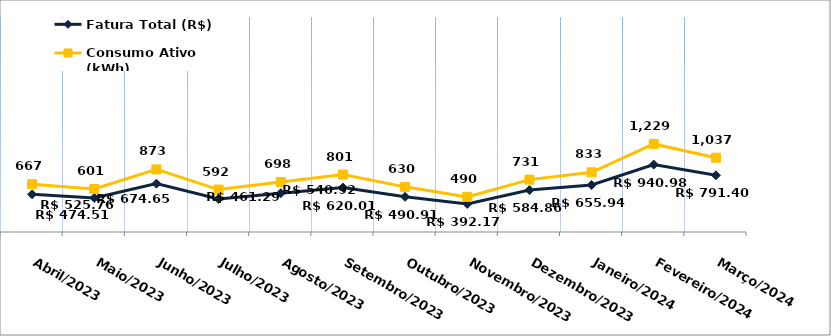
| Category | Fatura Total (R$) | Consumo Ativo (kWh) |
|---|---|---|
| Abril/2023 | 525.76 | 667 |
| Maio/2023 | 474.51 | 601 |
| Junho/2023 | 674.65 | 873 |
| Julho/2023 | 461.29 | 592 |
| Agosto/2023 | 540.92 | 698 |
| Setembro/2023 | 620.01 | 801 |
| Outubro/2023 | 490.91 | 630 |
| Novembro/2023 | 392.17 | 490 |
| Dezembro/2023 | 584.86 | 731 |
| Janeiro/2024 | 655.94 | 833 |
| Fevereiro/2024 | 940.98 | 1229 |
| Março/2024 | 791.4 | 1037 |